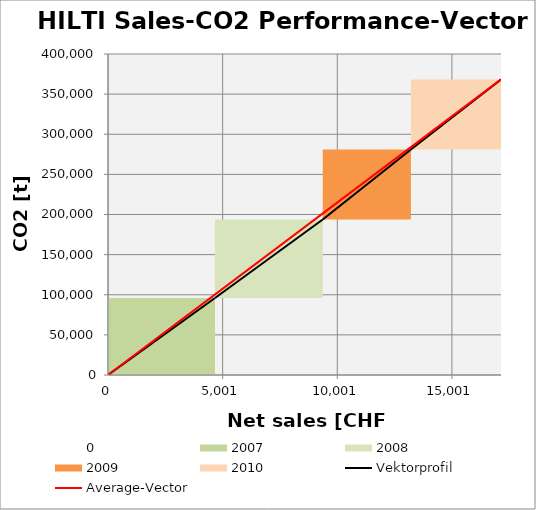
| Category | transparent | 0 | 2007 | 2008 | 2009 | 2010 | none | Border right & top |
|---|---|---|---|---|---|---|---|---|
| 0.0 | 0 | 0 | 0 | 0 | 0 | 0 | 0 | 0 |
| 0.0 | 0 | 0 | 0 | 0 | 0 | 0 | 0 | 0 |
| 0.0 | 0 | 0 | 95958 | 0 | 0 | 0 | 0 | 0 |
| 4667.0 | 0 | 0 | 95958 | 0 | 0 | 0 | 0 | 0 |
| 4667.0 | 95958 | 0 | 0 | 97853 | 0 | 0 | 0 | 0 |
| 9367.0 | 95958 | 0 | 0 | 97853 | 0 | 0 | 0 | 0 |
| 9367.0 | 193811 | 0 | 0 | 0 | 87209 | 0 | 0 | 0 |
| 13212.0 | 193811 | 0 | 0 | 0 | 87209 | 0 | 0 | 0 |
| 13212.0 | 281020 | 0 | 0 | 0 | 0 | 87304 | 0 | 0 |
| 17142.0 | 281020 | 0 | 0 | 0 | 0 | 87304 | 0 | 0 |
| 17142.0 | 368324 | 0 | 0 | 0 | 0 | 0 | 0 | 0 |
| 17142.0 | 368324 | 0 | 0 | 0 | 0 | 0 | 0 | 0 |
| 17142.0 | 368324 | 0 | 0 | 0 | 0 | 0 | 0 | 0 |
| 17142.0 | 368324 | 0 | 0 | 0 | 0 | 0 | 0 | 0 |
| 17142.0 | 368324 | 0 | 0 | 0 | 0 | 0 | 0 | 0 |
| 17142.0 | 368324 | 0 | 0 | 0 | 0 | 0 | 0 | 0 |
| 17142.0 | 368324 | 0 | 0 | 0 | 0 | 0 | 0 | 0 |
| 17142.0 | 368324 | 0 | 0 | 0 | 0 | 0 | 0 | 0 |
| 17142.0 | 368324 | 0 | 0 | 0 | 0 | 0 | 0 | 0 |
| 17142.0 | 368324 | 0 | 0 | 0 | 0 | 0 | 0 | 0 |
| 17142.0 | 368324 | 0 | 0 | 0 | 0 | 0 | 0 | 0 |
| 17142.0 | 368324 | 0 | 0 | 0 | 0 | 0 | 0 | 0 |
| 17142.0 | 368324 | 0 | 0 | 0 | 0 | 0 | 0 | 0 |